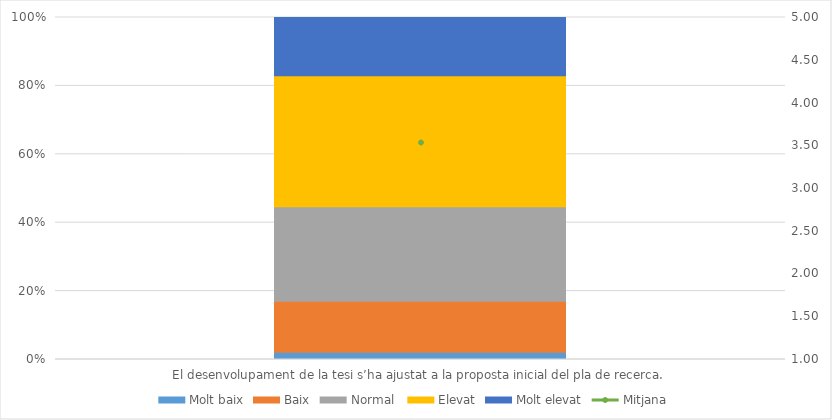
| Category | Molt baix | Baix | Normal  | Elevat | Molt elevat |
|---|---|---|---|---|---|
| El desenvolupament de la tesi s’ha ajustat a la proposta inicial del pla de recerca. | 1 | 7 | 13 | 18 | 8 |